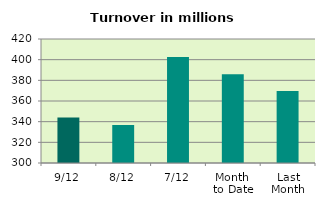
| Category | Series 0 |
|---|---|
| 9/12 | 344.046 |
| 8/12 | 336.8 |
| 7/12 | 402.563 |
| Month 
to Date | 385.943 |
| Last
Month | 369.747 |